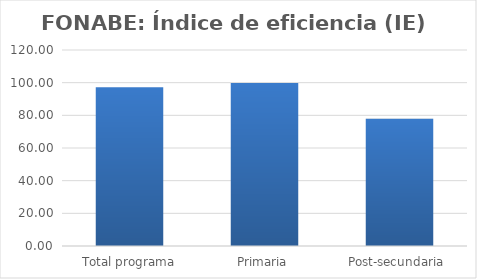
| Category | Índice de eficiencia (IE)  |
|---|---|
| Total programa | 97.188 |
| Primaria | 99.734 |
| Post-secundaria  | 77.967 |